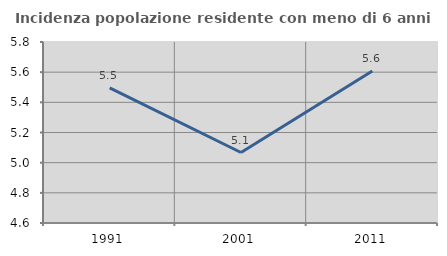
| Category | Incidenza popolazione residente con meno di 6 anni |
|---|---|
| 1991.0 | 5.496 |
| 2001.0 | 5.067 |
| 2011.0 | 5.608 |